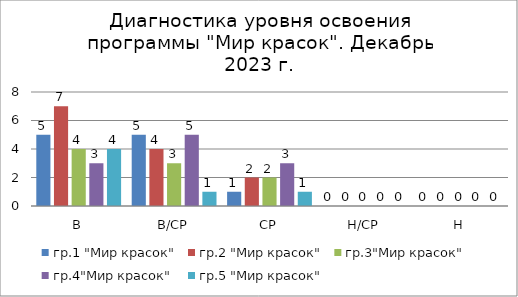
| Category | гр.1 "Мир красок" | гр.2 "Мир красок" | гр.3"Мир красок" | гр.4"Мир красок" | гр.5 "Мир красок" |
|---|---|---|---|---|---|
| В | 5 | 7 | 4 | 3 | 4 |
| В/СР | 5 | 4 | 3 | 5 | 1 |
| СР | 1 | 2 | 2 | 3 | 1 |
| Н/СР | 0 | 0 | 0 | 0 | 0 |
| Н | 0 | 0 | 0 | 0 | 0 |